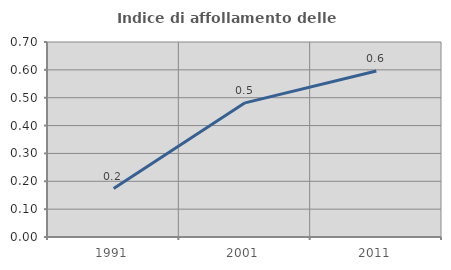
| Category | Indice di affollamento delle abitazioni  |
|---|---|
| 1991.0 | 0.174 |
| 2001.0 | 0.482 |
| 2011.0 | 0.596 |